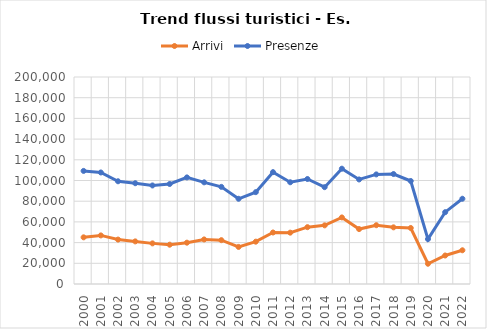
| Category | Arrivi | Presenze |
|---|---|---|
| 2000.0 | 45091 | 109261 |
| 2001.0 | 46942 | 107753 |
| 2002.0 | 42920 | 99250 |
| 2003.0 | 41172 | 97374 |
| 2004.0 | 39254 | 95213 |
| 2005.0 | 37977 | 96637 |
| 2006.0 | 39928 | 102987 |
| 2007.0 | 43050 | 98234 |
| 2008.0 | 42350 | 93843 |
| 2009.0 | 35813 | 82340 |
| 2010.0 | 40903 | 88738 |
| 2011.0 | 49767 | 108066 |
| 2012.0 | 49606 | 98295 |
| 2013.0 | 54904 | 101444 |
| 2014.0 | 56671 | 93573 |
| 2015.0 | 64309 | 111401 |
| 2016.0 | 53064 | 101001 |
| 2017.0 | 56808 | 105900 |
| 2018.0 | 54735 | 106242 |
| 2019.0 | 54129 | 99526 |
| 2020.0 | 19568 | 43394 |
| 2021.0 | 27531 | 69390 |
| 2022.0 | 32585 | 82375 |